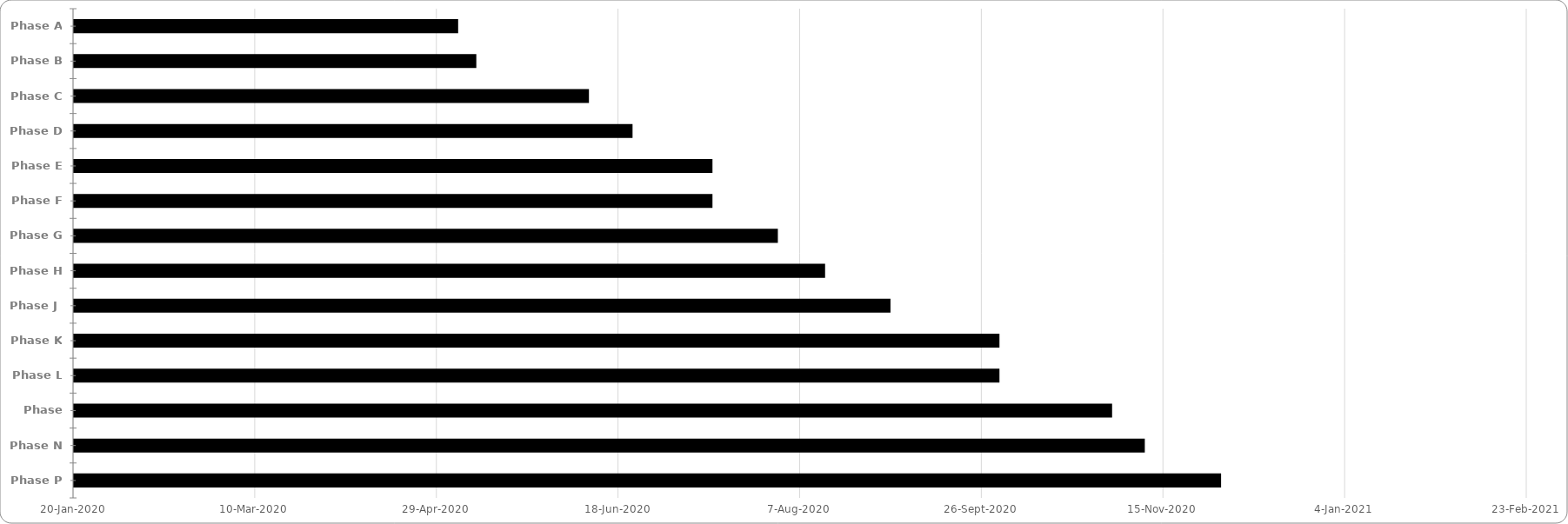
| Category | BEGINN |
|---|---|
| Phase A | 2020-05-05 |
| Phase B | 2020-05-10 |
| Phase C | 2020-06-10 |
| Phase D | 2020-06-22 |
| Phase E | 2020-07-14 |
| Phase F | 2020-07-14 |
| Phase G | 2020-08-01 |
| Phase H | 2020-08-14 |
| Phase J | 2020-09-01 |
| Phase K | 2020-10-01 |
| Phase L | 2020-10-01 |
| Phase M | 2020-11-01 |
| Phase N | 2020-11-10 |
| Phase P | 2020-12-01 |